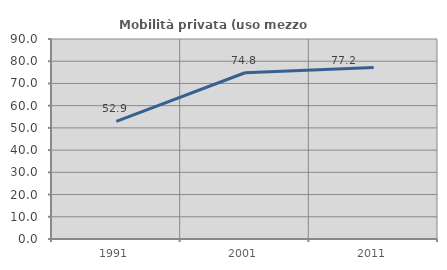
| Category | Mobilità privata (uso mezzo privato) |
|---|---|
| 1991.0 | 52.941 |
| 2001.0 | 74.815 |
| 2011.0 | 77.181 |